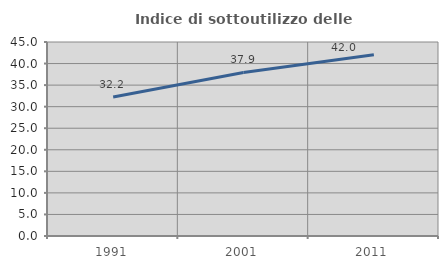
| Category | Indice di sottoutilizzo delle abitazioni  |
|---|---|
| 1991.0 | 32.245 |
| 2001.0 | 37.945 |
| 2011.0 | 42.045 |